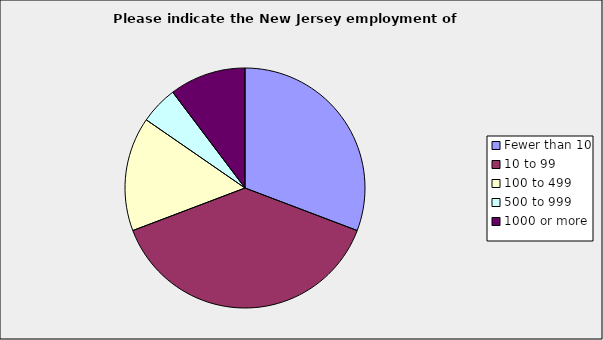
| Category | Series 0 |
|---|---|
| Fewer than 10 | 0.308 |
| 10 to 99 | 0.385 |
| 100 to 499 | 0.154 |
| 500 to 999 | 0.051 |
| 1000 or more | 0.103 |